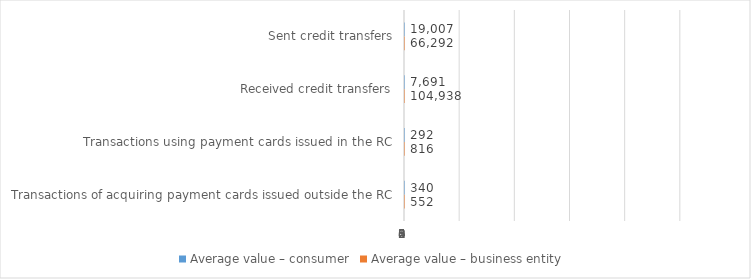
| Category | Average value – consumer | Average value – business entity  |
|---|---|---|
| Sent credit transfers | 19007.428 | 66291.832 |
| Received credit transfers | 7690.533 | 104937.579 |
| Transactions using payment cards issued in the RC | 291.97 | 815.655 |
| Transactions of acquiring payment cards issued outside the RC | 340.042 | 551.755 |